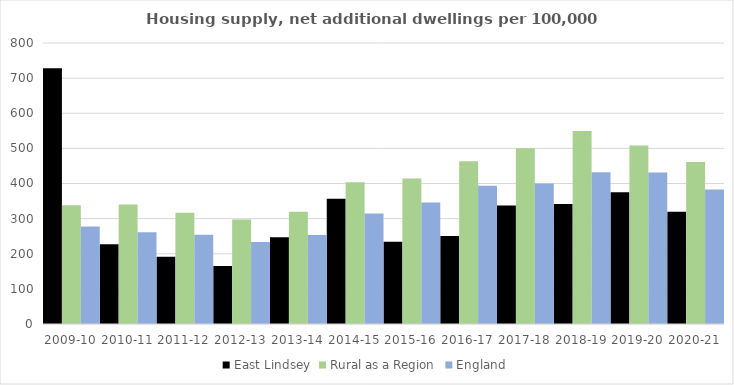
| Category | East Lindsey | Rural as a Region | England |
|---|---|---|---|
| 2009-10 | 728.234 | 337.852 | 277.548 |
| 2010-11 | 227.102 | 340.105 | 260.994 |
| 2011-12 | 191.684 | 317.04 | 254.007 |
| 2012-13 | 165.385 | 297.763 | 233.153 |
| 2013-14 | 247.078 | 319.835 | 253.602 |
| 2014-15 | 356.515 | 403.796 | 314.256 |
| 2015-16 | 233.943 | 414.091 | 346.154 |
| 2016-17 | 250.823 | 463.209 | 393.256 |
| 2017-18 | 337.108 | 500.68 | 399.646 |
| 2018-19 | 341.763 | 549.491 | 432.099 |
| 2019-20 | 375.37 | 508.493 | 431.187 |
| 2020-21 | 319.651 | 461.114 | 382.827 |